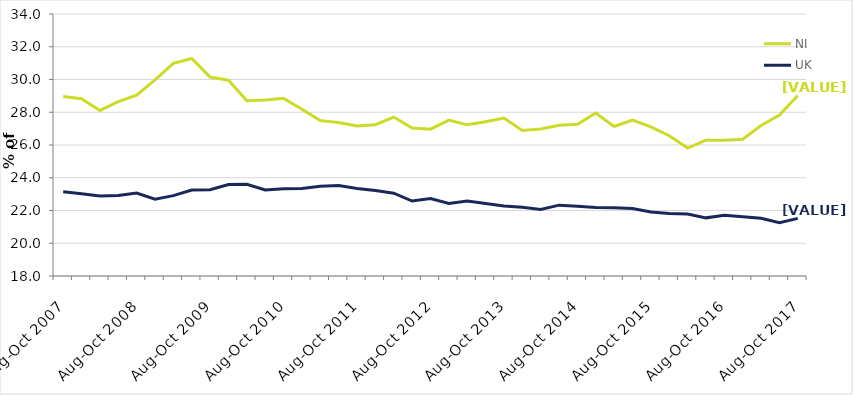
| Category | NI | UK |
|---|---|---|
| Aug-Oct 2007 | 28.956 | 23.15 |
| Nov-Jan 2008 | 28.821 | 23.021 |
| Feb-Apr 2008 | 28.11 | 22.885 |
| May-Jul 2008 | 28.646 | 22.919 |
| Aug-Oct 2008 | 29.05 | 23.071 |
| Nov-Jan 2009 | 29.973 | 22.695 |
| Feb-Apr 2009 | 30.984 | 22.908 |
| May-Jul 2009 | 31.286 | 23.255 |
| Aug-Oct 2009 | 30.153 | 23.274 |
| Nov-Jan 2010 | 29.959 | 23.587 |
| Feb-Apr 2010 | 28.705 | 23.606 |
| May-Jul 2010 | 28.743 | 23.252 |
| Aug-Oct 2010 | 28.847 | 23.329 |
| Nov-Jan 2011 | 28.18 | 23.34 |
| Feb-Apr 2011 | 27.489 | 23.483 |
| May-Jul 2011 | 27.377 | 23.531 |
| Aug-Oct 2011 | 27.162 | 23.344 |
| Nov-Jan 2012 | 27.239 | 23.218 |
| Feb-Apr 2012 | 27.705 | 23.058 |
| May-Jul 2012 | 27.041 | 22.577 |
| Aug-Oct 2012 | 26.965 | 22.726 |
| Nov-Jan 2013 | 27.521 | 22.423 |
| Feb-Apr 2013 | 27.231 | 22.577 |
| May-Jul 2013 | 27.414 | 22.433 |
| Aug-Oct 2013 | 27.645 | 22.269 |
| Nov-Jan 2014 | 26.888 | 22.203 |
| Feb-Apr 2014 | 26.972 | 22.058 |
| May-Jul 2014 | 27.201 | 22.327 |
| Aug-Oct 2014 | 27.267 | 22.264 |
| Nov-Jan 2015 | 27.95 | 22.18 |
| Feb-Apr 2015 | 27.128 | 22.166 |
| May-Jul 2015 | 27.524 | 22.124 |
| Aug-Oct 2015 | 27.102 | 21.908 |
| Nov-Jan 2016 | 26.568 | 21.811 |
| Feb-Apr 2016 | 25.812 | 21.779 |
| May-Jul 2016 | 26.297 | 21.551 |
| Aug-Oct 2016 | 26.285 | 21.716 |
| Nov-Jan 2017 | 26.347 | 21.617 |
| Feb-Apr 2017 | 27.187 | 21.526 |
| May-Jul 2017 | 27.825 | 21.249 |
| Aug-Oct 2017 | 29.018 | 21.517 |